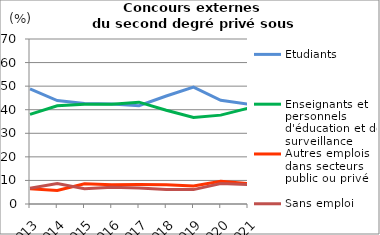
| Category | Étudiants | Enseignants et personnels d'éducation et de surveillance                            | Autres emplois dans secteurs public ou privé                | Sans emploi                    |
|---|---|---|---|---|
| 2013.0 | 48.8 | 38 | 6.5 | 6.7 |
| 2014.0 | 43.9 | 41.7 | 5.7 | 8.7 |
| 2015.0 | 42.6 | 42.3 | 8.6 | 6.5 |
| 2016.0 | 42.4 | 42.3 | 8.2 | 7.1 |
| 2017.0 | 41.7 | 43.2 | 8.3 | 6.8 |
| 2018.0 | 45.8 | 39.8 | 8.2 | 6.2 |
| 2019.0 | 49.6 | 36.7 | 7.6 | 6.1 |
| 2020.0 | 44 | 37.7 | 9.6 | 8.7 |
| 2021.0 | 42.4 | 40.6 | 8.7 | 8.3 |